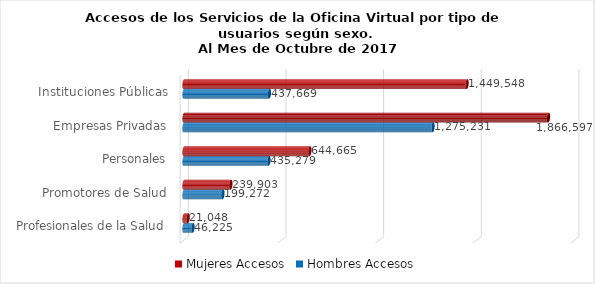
| Category | Mujeres | Hombres |
|---|---|---|
| Instituciones Públicas | 1449548 | 437669 |
| Empresas Privadas | 1866597 | 1275231 |
| Personales | 644665 | 435279 |
| Promotores de Salud | 239903 | 199272 |
| Profesionales de la Salud | 21048 | 46225 |